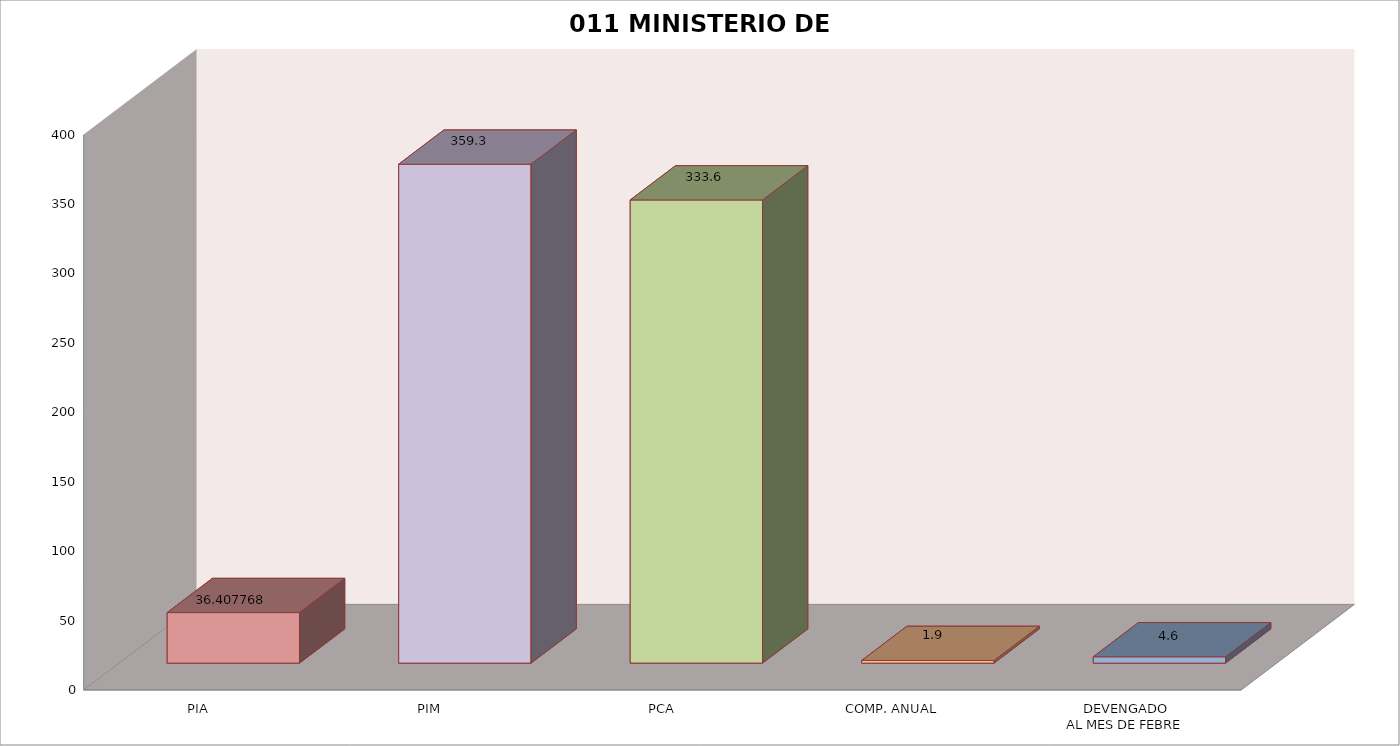
| Category | 011 MINISTERIO DE SALUD |
|---|---|
| PIA | 36.408 |
| PIM | 359.33 |
| PCA | 333.562 |
| COMP. ANUAL | 1.921 |
| DEVENGADO
AL MES DE FEBRE | 4.555 |